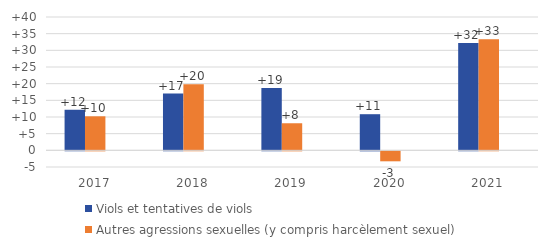
| Category | Viols et tentatives de viols | Autres agressions sexuelles (y compris harcèlement sexuel) | Series 2 |
|---|---|---|---|
| 2017.0 | 12.202 | 10.211 |  |
| 2018.0 | 17.044 | 19.851 |  |
| 2019.0 | 18.689 | 8.125 |  |
| 2020.0 | 10.84 | -2.992 |  |
| 2021.0 | 32.18 | 33.297 |  |